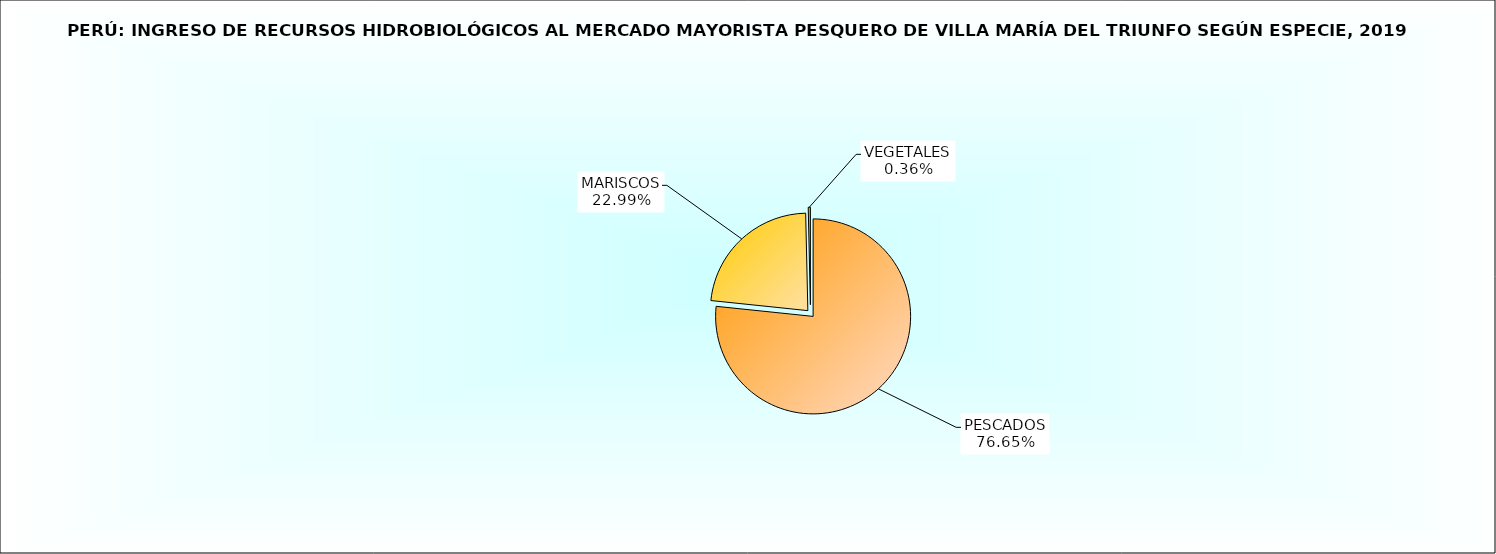
| Category | Series 0 |
|---|---|
| PESCADOS | 0.766 |
| MARISCOS | 0.23 |
| VEGETALES | 0.004 |